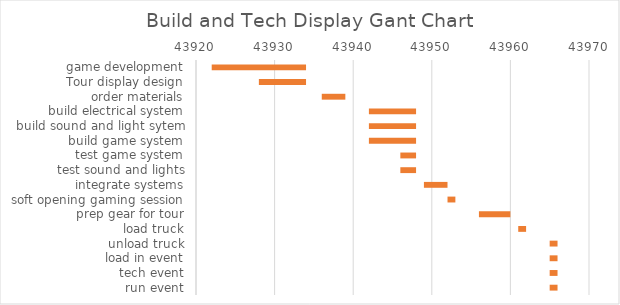
| Category | Series 0 | duration |
|---|---|---|
| game development | 43922 | 12 |
| Tour display design | 43928 | 6 |
| order materials | 43936 | 3 |
| build electrical system | 43942 | 6 |
| build sound and light sytem | 43942 | 6 |
| build game system | 43942 | 6 |
| test game system | 43946 | 2 |
| test sound and lights | 43946 | 2 |
| integrate systems | 43949 | 3 |
| soft opening gaming session | 43952 | 1 |
| prep gear for tour | 43956 | 4 |
| load truck | 43961 | 1 |
| unload truck | 43965 | 1 |
| load in event | 43965 | 1 |
| tech event | 43965 | 1 |
| run event | 43965 | 1 |